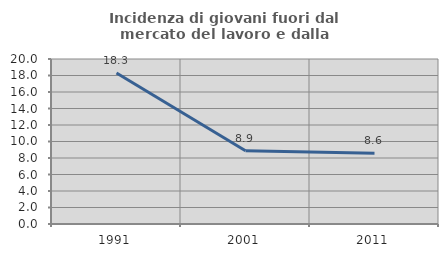
| Category | Incidenza di giovani fuori dal mercato del lavoro e dalla formazione  |
|---|---|
| 1991.0 | 18.31 |
| 2001.0 | 8.889 |
| 2011.0 | 8.571 |